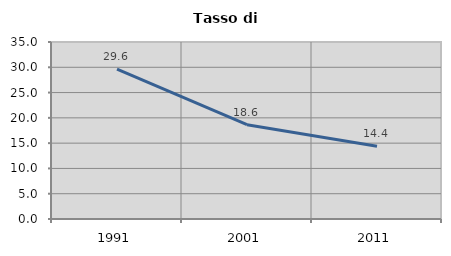
| Category | Tasso di disoccupazione   |
|---|---|
| 1991.0 | 29.641 |
| 2001.0 | 18.639 |
| 2011.0 | 14.405 |